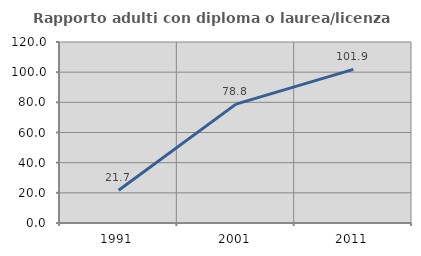
| Category | Rapporto adulti con diploma o laurea/licenza media  |
|---|---|
| 1991.0 | 21.739 |
| 2001.0 | 78.808 |
| 2011.0 | 101.887 |